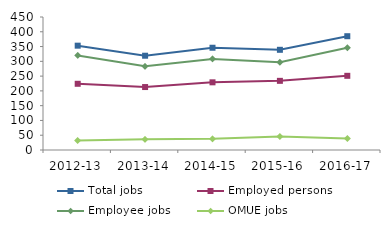
| Category | Total jobs | Employed persons | Employee jobs | OMUE jobs |
|---|---|---|---|---|
| 2012-13 | 353 | 224 | 320 | 32 |
| 2013-14 | 319 | 213 | 283 | 36 |
| 2014-15 | 346 | 229 | 308 | 38 |
| 2015-16 | 339 | 234 | 297 | 46 |
| 2016-17 | 385 | 251 | 346 | 39 |